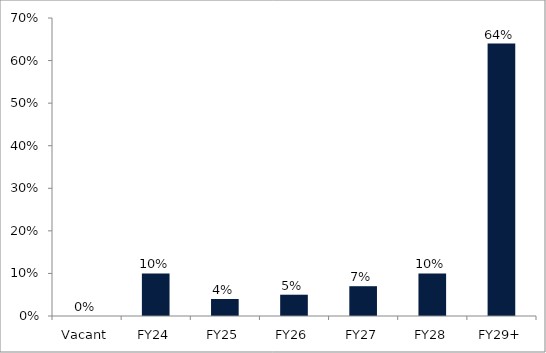
| Category | Series 0 |
|---|---|
| Vacant | 0 |
| FY24 | 0.1 |
| FY25 | 0.04 |
| FY26 | 0.05 |
| FY27 | 0.07 |
| FY28 | 0.1 |
| FY29+ | 0.64 |